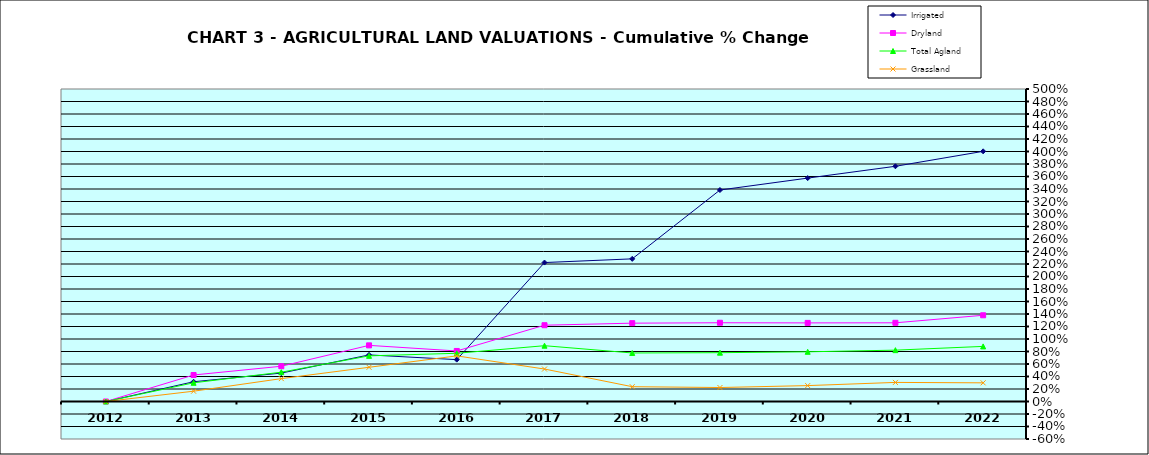
| Category | Irrigated | Dryland | Total Agland | Grassland |
|---|---|---|---|---|
| 2012.0 | 0 | 0 | 0 | 0 |
| 2013.0 | 0.316 | 0.424 | 0.299 | 0.165 |
| 2014.0 | 0.455 | 0.564 | 0.469 | 0.366 |
| 2015.0 | 0.745 | 0.898 | 0.73 | 0.547 |
| 2016.0 | 0.67 | 0.809 | 0.771 | 0.73 |
| 2017.0 | 2.223 | 1.221 | 0.893 | 0.519 |
| 2018.0 | 2.282 | 1.253 | 0.776 | 0.237 |
| 2019.0 | 3.384 | 1.26 | 0.781 | 0.224 |
| 2020.0 | 3.574 | 1.258 | 0.795 | 0.254 |
| 2021.0 | 3.763 | 1.259 | 0.822 | 0.305 |
| 2022.0 | 4.003 | 1.38 | 0.882 | 0.299 |